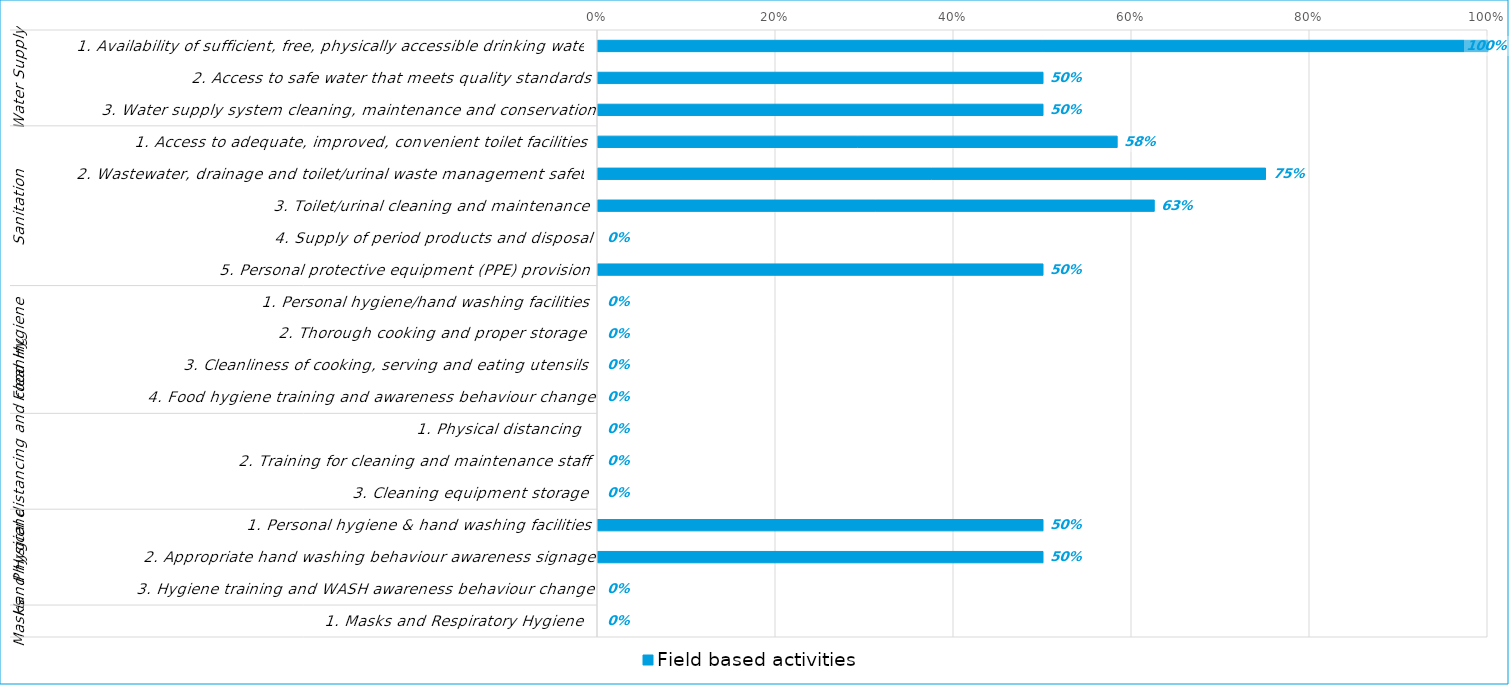
| Category | Field based activities  |
|---|---|
| 0 | 1 |
| 1 | 0.5 |
| 2 | 0.5 |
| 3 | 0.583 |
| 4 | 0.75 |
| 5 | 0.625 |
| 6 | 0 |
| 7 | 0.5 |
| 8 | 0 |
| 9 | 0 |
| 10 | 0 |
| 11 | 0 |
| 12 | 0 |
| 13 | 0 |
| 14 | 0 |
| 15 | 0.5 |
| 16 | 0.5 |
| 17 | 0 |
| 18 | 0 |